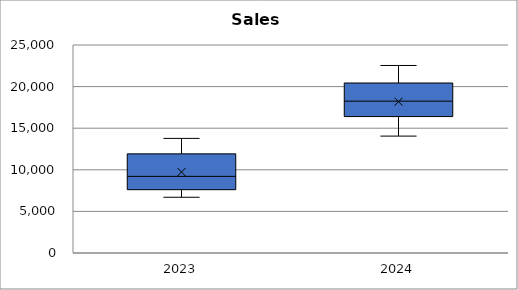
| Category | Sales |
|---|---|
| 2023-01-01 | 6700 |
| 2023-02-01 | 7303 |
| 2023-03-01 | 7668.15 |
| 2023-04-01 | 7591.469 |
| 2023-05-01 | 8274.701 |
| 2023-06-01 | 8771.183 |
| 2023-07-01 | 9648.301 |
| 2023-08-01 | 10613.131 |
| 2023-09-01 | 11568.313 |
| 2023-10-01 | 12031.045 |
| 2023-11-01 | 12873.219 |
| 2023-12-01 | 13774.344 |
| 2024-01-01 | 14049.831 |
| 2024-02-01 | 15173.817 |
| 2024-03-01 | 16235.984 |
| 2024-04-01 | 16885.424 |
| 2024-05-01 | 17391.986 |
| 2024-06-01 | 18435.506 |
| 2024-07-01 | 18435.506 |
| 2024-08-01 | 18066.796 |
| 2024-09-01 | 19692.807 |
| 2024-10-01 | 20677.448 |
| 2024-11-01 | 20677.448 |
| 2024-12-01 | 22538.418 |